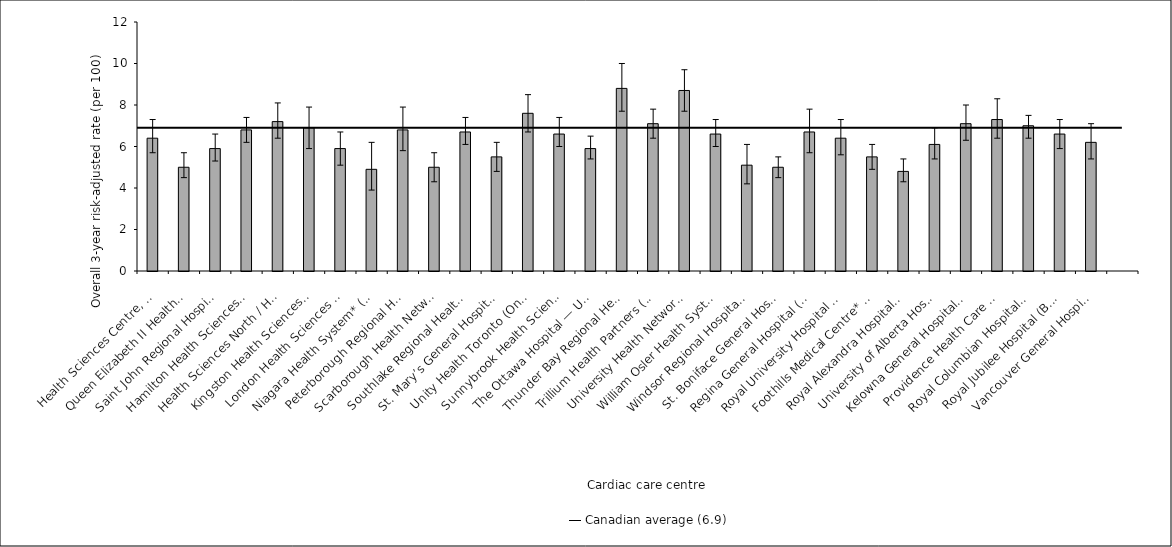
| Category | Risk-adjusted rate |
|---|---|
| Health Sciences Centre, St. John’s (N.L.) | 6.4 |
| Queen Elizabeth II Health Sciences Centre* (N.S.) | 5 |
| Saint John Regional Hospital* (N.B.) | 5.9 |
| Hamilton Health Sciences (Ont.) | 6.8 |
| Health Sciences North / Horizon Santé-Nord (Ont.) | 7.2 |
| Kingston Health Sciences Centre (Ont.) | 6.9 |
| London Health Sciences Centre* (Ont.) | 5.9 |
| Niagara Health System* (Ont.) | 4.9 |
| Peterborough Regional Health Centre (Ont.) | 6.8 |
| Scarborough Health Network* (Ont.) | 5 |
| Southlake Regional Health Centre (Ont.) | 6.7 |
| St. Mary’s General Hospital* (Ont.) | 5.5 |
| Unity Health Toronto (Ont.) | 7.6 |
| Sunnybrook Health Sciences Centre (Ont.) | 6.6 |
| The Ottawa Hospital — University of Ottawa Heart Institute* (Ont.) | 5.9 |
| Thunder Bay Regional Health Sciences Centre* (Ont.) | 8.8 |
| Trillium Health Partners (Ont.) | 7.1 |
| University Health Network* (Ont.) | 8.7 |
| William Osler Health System (Ont.) | 6.6 |
| Windsor Regional Hospital* (Ont.) | 5.1 |
| St. Boniface General Hospital* (Man.) | 5 |
| Regina General Hospital (Sask.) | 6.7 |
| Royal University Hospital (Sask.) | 6.4 |
| Foothills Medical Centre* (Alta.) | 5.5 |
| Royal Alexandra Hospital* (Alta.) | 4.8 |
| University of Alberta Hospital (Alta.) | 6.1 |
| Kelowna General Hospital (B.C.) | 7.1 |
| Providence Health Care — St. Paul’s Hospital (Vancouver) (B.C.) | 7.3 |
| Royal Columbian Hospital (B.C.) | 7 |
| Royal Jubilee Hospital (B.C.) | 6.6 |
| Vancouver General Hospital (B.C.) | 6.2 |